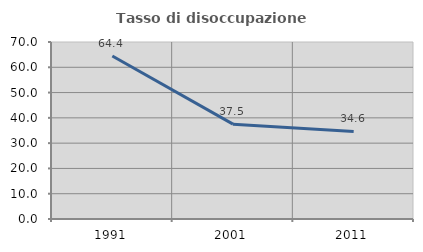
| Category | Tasso di disoccupazione giovanile  |
|---|---|
| 1991.0 | 64.444 |
| 2001.0 | 37.5 |
| 2011.0 | 34.615 |